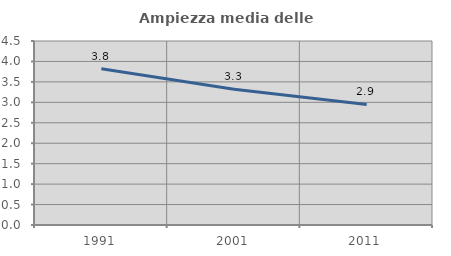
| Category | Ampiezza media delle famiglie |
|---|---|
| 1991.0 | 3.821 |
| 2001.0 | 3.32 |
| 2011.0 | 2.95 |